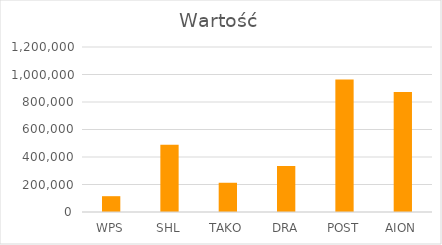
| Category | Wartość |
|---|---|
| WPS | 115000 |
| SHL | 489950 |
| TAKO | 212686 |
| DRA | 334600 |
| POST | 963390 |
| AION | 873290 |